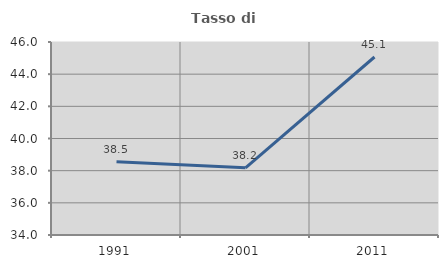
| Category | Tasso di occupazione   |
|---|---|
| 1991.0 | 38.547 |
| 2001.0 | 38.175 |
| 2011.0 | 45.068 |